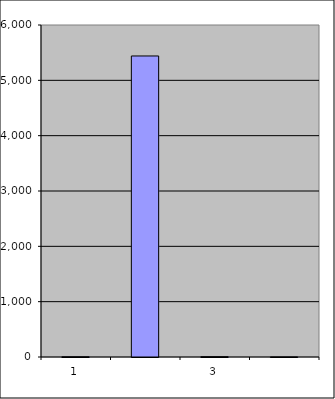
| Category | Series 0 |
|---|---|
| 0 | 4.25 |
| 1 | 5440.198 |
| 2 | 6.337 |
| 3 | 1.209 |